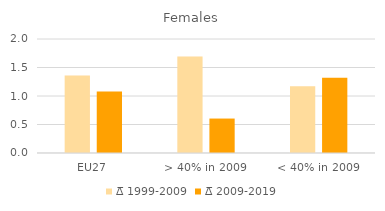
| Category | ∆̅ 1999-2009 | ∆̅ 2009-2019 |
|---|---|---|
| EU27 | 1.36 | 1.08 |
| > 40% in 2009 | 1.692 | 0.604 |
| < 40% in 2009 | 1.173 | 1.318 |